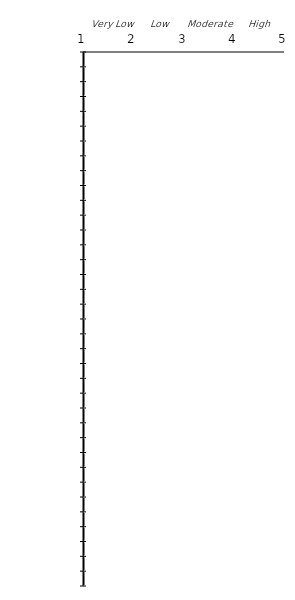
| Category | Series 0 |
|---|---|
| 1.0 | 0 |
| 2.0 | 0 |
| 3.0 | 0 |
| 4.0 | 0 |
| 5.0 | 0 |
| 6.0 | 0 |
| 7.0 | 0 |
| 8.0 | 0 |
| 9.0 | 0 |
| 10.0 | 0 |
| 11.0 | 0 |
| 12.0 | 0 |
| 13.0 | 0 |
| 14.0 | 0 |
| 15.0 | 0 |
| 16.0 | 0 |
| 17.0 | 0 |
| 18.0 | 0 |
| 19.0 | 0 |
| 20.0 | 0 |
| 21.0 | 0 |
| 22.0 | 0 |
| 23.0 | 0 |
| 24.0 | 0 |
| 25.0 | 0 |
| 26.0 | 0 |
| 27.0 | 0 |
| 28.0 | 0 |
| 29.0 | 0 |
| 30.0 | 0 |
| 31.0 | 0 |
| 32.0 | 0 |
| 33.0 | 0 |
| 34.0 | 0 |
| 35.0 | 0 |
| 36.0 | 0 |